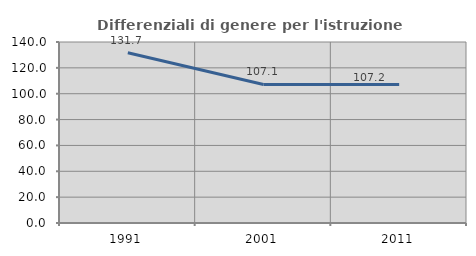
| Category | Differenziali di genere per l'istruzione superiore |
|---|---|
| 1991.0 | 131.697 |
| 2001.0 | 107.136 |
| 2011.0 | 107.162 |